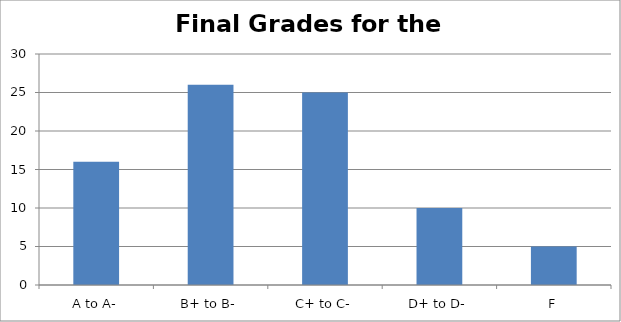
| Category | Class |
|---|---|
| A to A- | 16 |
| B+ to B- | 26 |
| C+ to C- | 25 |
| D+ to D- | 10 |
| F | 5 |